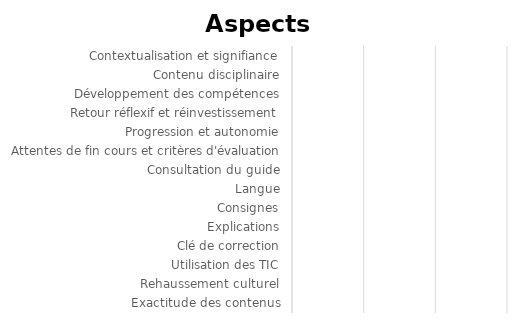
| Category | Series 0 |
|---|---|
| Contextualisation et signifiance | 0 |
| Contenu disciplinaire | 0 |
| Développement des compétences | 0 |
| Retour réflexif et réinvestissement | 0 |
| Progression et autonomie | 0 |
| Attentes de fin cours et critères d'évaluation | 0 |
| Consultation du guide | 0 |
| Langue | 0 |
| Consignes | 0 |
| Explications | 0 |
| Clé de correction | 0 |
| Utilisation des TIC | 0 |
| Rehaussement culturel | 0 |
| Exactitude des contenus | 0 |